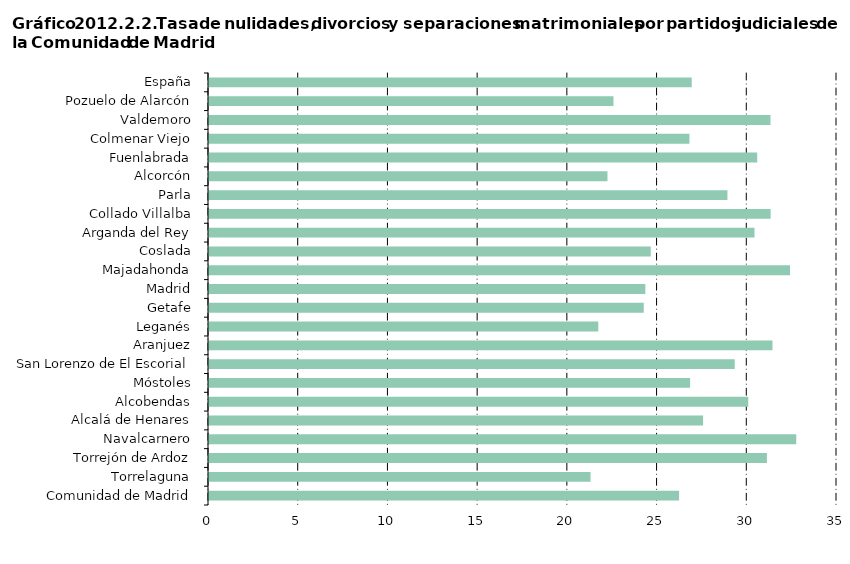
| Category | Series 0 |
|---|---|
| Comunidad de Madrid | 26.2 |
|     Torrelaguna | 21.264 |
|     Torrejón de Ardoz | 31.093 |
|     Navalcarnero | 32.73 |
|     Alcalá de Henares | 27.536 |
|     Alcobendas | 30.053 |
|     Móstoles | 26.815 |
|     San Lorenzo de El Escorial | 29.3 |
|     Aranjuez | 31.404 |
|     Leganés | 21.697 |
|     Getafe | 24.229 |
|     Madrid | 24.317 |
|     Majadahonda | 32.381 |
|     Coslada | 24.621 |
|     Arganda del Rey | 30.401 |
|     Collado Villalba | 31.301 |
|     Parla | 28.894 |
|     Alcorcón | 22.208 |
|     Fuenlabrada | 30.553 |
|     Colmenar Viejo | 26.776 |
|     Valdemoro | 31.291 |
|     Pozuelo de Alarcón | 22.542 |
| España | 26.903 |